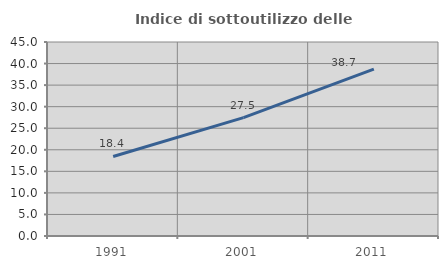
| Category | Indice di sottoutilizzo delle abitazioni  |
|---|---|
| 1991.0 | 18.443 |
| 2001.0 | 27.451 |
| 2011.0 | 38.698 |